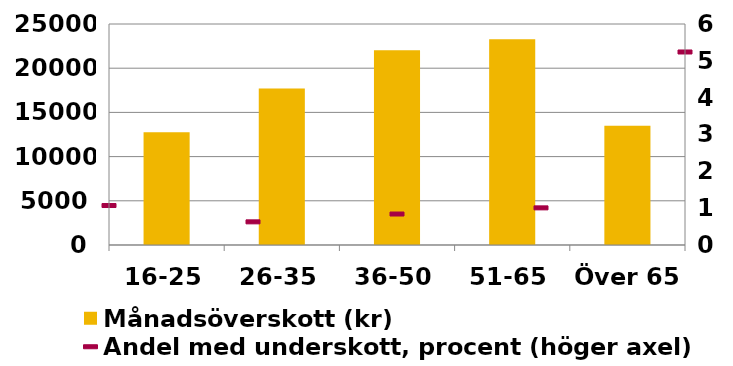
| Category | Månadsöverskott (kr) |
|---|---|
| 16-25 | 12752.762 |
| 26-35 | 17715.994 |
| 36-50 | 22034.151 |
| 51-65 | 23285.002 |
| Över 65 | 13489.685 |